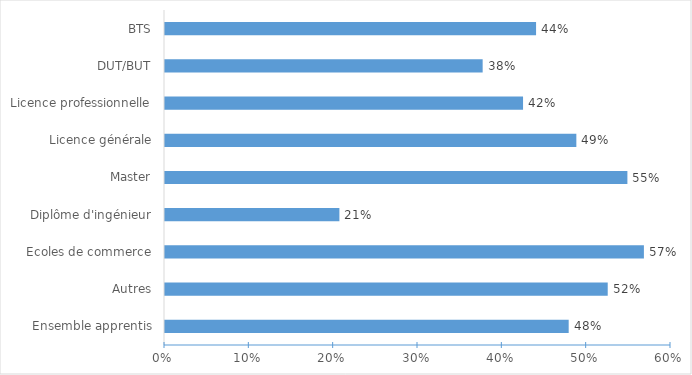
| Category | Pourcentage de femmes |
|---|---|
| Ensemble apprentis | 0.479 |
| Autres | 0.525 |
| Ecoles de commerce | 0.568 |
| Diplôme d'ingénieur | 0.207 |
| Master | 0.548 |
| Licence générale | 0.488 |
| Licence professionnelle | 0.425 |
| DUT/BUT | 0.377 |
| BTS | 0.44 |